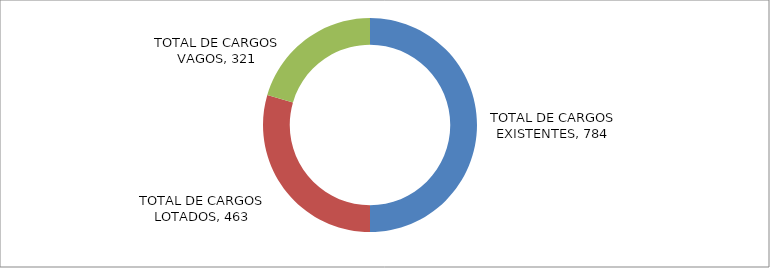
| Category | Series 0 | Series 1 |
|---|---|---|
| TOTAL DE CARGOS EXISTENTES |  | 784 |
| TOTAL DE CARGOS LOTADOS |  | 463 |
| TOTAL DE CARGOS VAGOS |  | 321 |